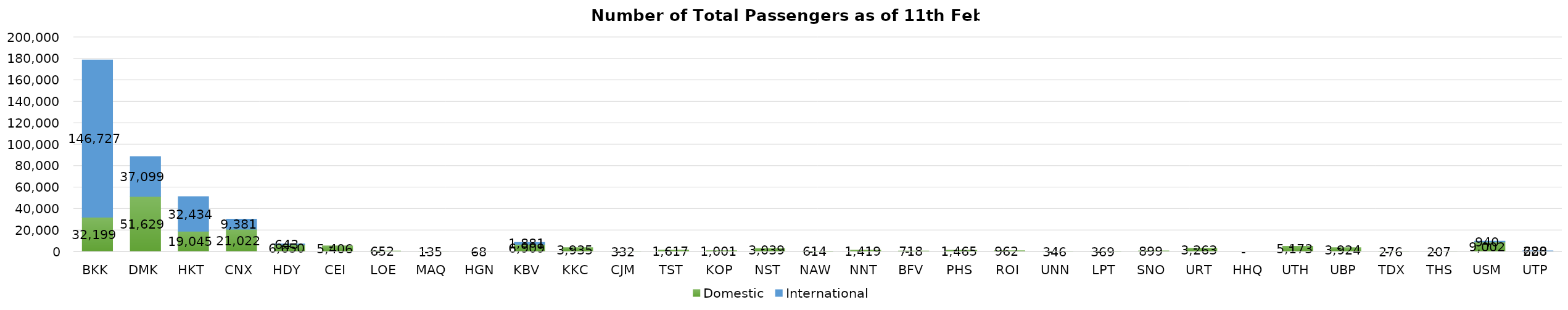
| Category | Domestic | International |
|---|---|---|
| BKK | 32199 | 146727 |
| DMK | 51629 | 37099 |
| HKT | 19045 | 32434 |
| CNX | 21022 | 9381 |
| HDY | 6650 | 643 |
| CEI | 5406 | 0 |
| LOE | 652 | 0 |
| MAQ | 135 | 0 |
| HGN | 68 | 0 |
| KBV | 6909 | 1881 |
| KKC | 3935 | 0 |
| CJM | 332 | 0 |
| TST | 1617 | 0 |
| KOP | 1001 | 0 |
| NST | 3039 | 0 |
| NAW | 614 | 0 |
| NNT | 1419 | 0 |
| BFV | 718 | 0 |
| PHS | 1465 | 0 |
| ROI | 962 | 0 |
| UNN | 346 | 0 |
| LPT | 369 | 0 |
| SNO | 899 | 0 |
| URT | 3263 | 0 |
| HHQ | 0 | 0 |
| UTH | 5173 | 0 |
| UBP | 3924 | 0 |
| TDX | 276 | 0 |
| THS | 207 | 0 |
| USM | 9002 | 940 |
| UTP | 628 | 280 |